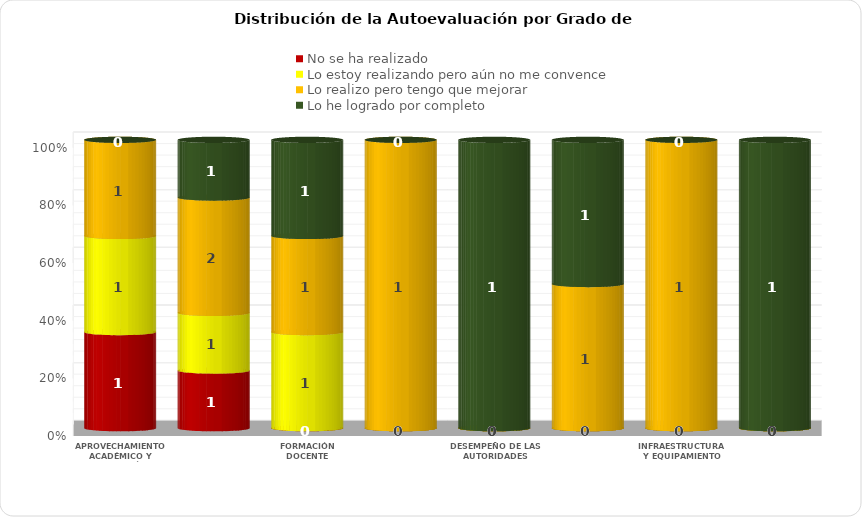
| Category | No se ha realizado | Lo estoy realizando pero aún no me convence | Lo realizo pero tengo que mejorar | Lo he logrado por completo |
|---|---|---|---|---|
| APROVECHAMIENTO ACADÉMICO Y PARTICIPACIÓN DE LOS ALUMNOS | 1 | 1 | 1 | 0 |
| PRÁCTICA DOCENTE | 1 | 1 | 2 | 1 |
| FORMACIÓN DOCENTE | 0 | 1 | 1 | 1 |
| AVANCE EN LOS PLANES Y PROGRAMAS EDUCATIVOS | 0 | 0 | 1 | 0 |
| DESEMPEÑO DE LAS AUTORIDADES ESCOLARES | 0 | 0 | 0 | 1 |
| PARTICIPACIÓN DE LA COMUNIDAD | 0 | 0 | 1 | 1 |
| INFRAESTRUCTURA Y EQUIPAMIENTO | 0 | 0 | 1 | 0 |
| HIGIENE Y SALUD | 0 | 0 | 0 | 1 |